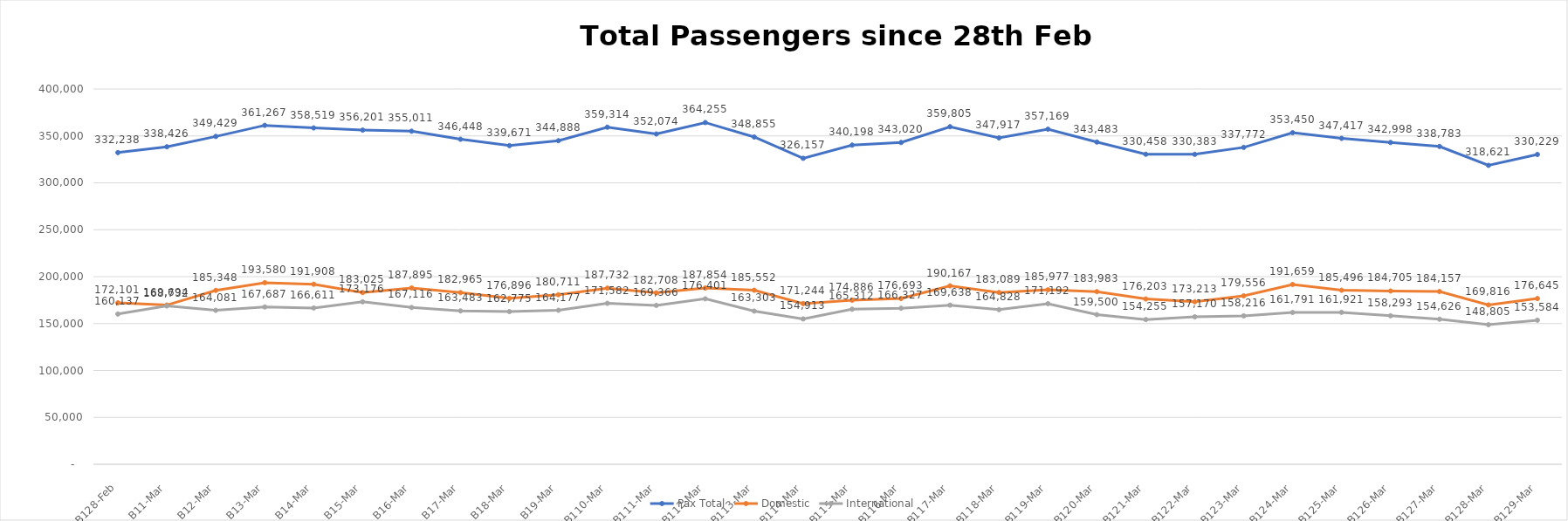
| Category | Pax Total |  Domestic  |  International  |
|---|---|---|---|
| 2023-02-28 | 332238 | 172101 | 160137 |
| 2023-03-01 | 338426 | 169694 | 168732 |
| 2023-03-02 | 349429 | 185348 | 164081 |
| 2023-03-03 | 361267 | 193580 | 167687 |
| 2023-03-04 | 358519 | 191908 | 166611 |
| 2023-03-05 | 356201 | 183025 | 173176 |
| 2023-03-06 | 355011 | 187895 | 167116 |
| 2023-03-07 | 346448 | 182965 | 163483 |
| 2023-03-08 | 339671 | 176896 | 162775 |
| 2023-03-09 | 344888 | 180711 | 164177 |
| 2023-03-10 | 359314 | 187732 | 171582 |
| 2023-03-11 | 352074 | 182708 | 169366 |
| 2023-03-12 | 364255 | 187854 | 176401 |
| 2023-03-13 | 348855 | 185552 | 163303 |
| 2023-03-14 | 326157 | 171244 | 154913 |
| 2023-03-15 | 340198 | 174886 | 165312 |
| 2023-03-16 | 343020 | 176693 | 166327 |
| 2023-03-17 | 359805 | 190167 | 169638 |
| 2023-03-18 | 347917 | 183089 | 164828 |
| 2023-03-19 | 357169 | 185977 | 171192 |
| 2023-03-20 | 343483 | 183983 | 159500 |
| 2023-03-21 | 330458 | 176203 | 154255 |
| 2023-03-22 | 330383 | 173213 | 157170 |
| 2023-03-23 | 337772 | 179556 | 158216 |
| 2023-03-24 | 353450 | 191659 | 161791 |
| 2023-03-25 | 347417 | 185496 | 161921 |
| 2023-03-26 | 342998 | 184705 | 158293 |
| 2023-03-27 | 338783 | 184157 | 154626 |
| 2023-03-28 | 318621 | 169816 | 148805 |
| 2023-03-29 | 330229 | 176645 | 153584 |